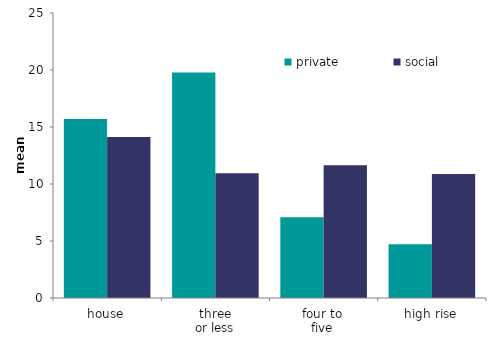
| Category | private | social |
|---|---|---|
| house | 15.706 | 14.133 |
| three
or less | 19.777 | 10.947 |
| four to 
five  | 7.082 | 11.635 |
| high rise | 4.721 | 10.875 |